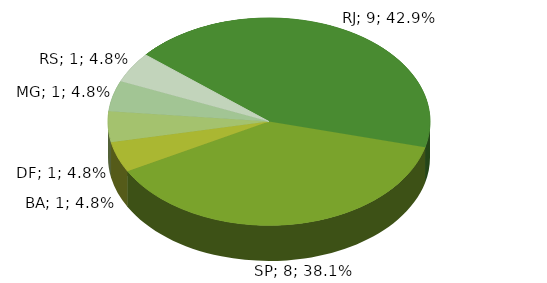
| Category | Series 0 |
|---|---|
| RJ | 9 |
| SP | 8 |
| BA | 1 |
| DF | 1 |
| MG | 1 |
| RS | 1 |